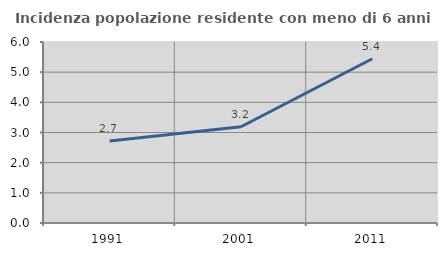
| Category | Incidenza popolazione residente con meno di 6 anni |
|---|---|
| 1991.0 | 2.718 |
| 2001.0 | 3.191 |
| 2011.0 | 5.446 |